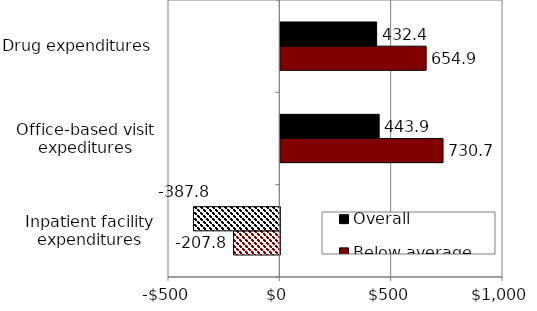
| Category | Below average health | Overall |
|---|---|---|
| Inpatient facility expenditures | -207.8 | -387.8 |
| Office-based visit expeditures | 730.7 | 443.9 |
| Drug expenditures | 654.9 | 432.4 |